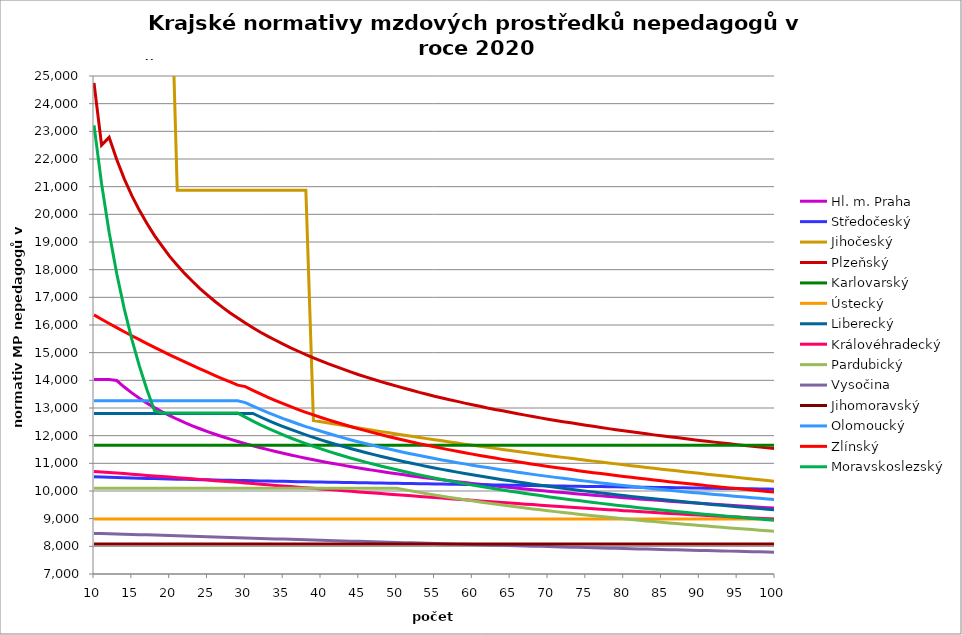
| Category | Hl. m. Praha | Středočeský | Jihočeský | Plzeňský | Karlovarský  | Ústecký   | Liberecký | Královéhradecký | Pardubický | Vysočina | Jihomoravský | Olomoucký | Zlínský | Moravskoslezský |
|---|---|---|---|---|---|---|---|---|---|---|---|---|---|---|
| 10.0 | 14030.172 | 10510.891 | 71798.217 | 24750.675 | 11657.998 | 8987.069 | 12801.653 | 10708.378 | 10101.406 | 8467.955 | 8087.211 | 13264.813 | 16364.86 | 23220 |
| 11.0 | 14030.172 | 10501.639 | 30465.73 | 22502.455 | 11657.998 | 8987.069 | 12801.653 | 10686.326 | 10101.406 | 8467.955 | 8087.211 | 13264.813 | 16208.331 | 21109.091 |
| 12.0 | 14030.172 | 10492.891 | 30465.73 | 22782.104 | 11657.998 | 8987.069 | 12801.653 | 10668.75 | 10101.406 | 8458.902 | 8087.211 | 13264.813 | 16054.768 | 19350 |
| 13.0 | 13992.888 | 10484.567 | 30465.73 | 21980.815 | 11657.998 | 8987.069 | 12801.653 | 10646.861 | 10101.406 | 8450.127 | 8087.211 | 13264.813 | 15904.087 | 17861.538 |
| 14.0 | 13757.851 | 10476.603 | 30465.73 | 21283.282 | 11657.998 | 8987.069 | 12801.653 | 10629.414 | 10101.406 | 8441.112 | 8087.211 | 13264.813 | 15756.209 | 16585.714 |
| 15.0 | 13545.701 | 10468.951 | 30465.73 | 20675.188 | 11657.998 | 8987.069 | 12801.653 | 10607.686 | 10101.406 | 8432.116 | 8087.211 | 13264.813 | 15611.055 | 15480 |
| 16.0 | 13352.792 | 10461.57 | 30465.73 | 20145.055 | 11657.998 | 8987.069 | 12801.653 | 10586.047 | 10101.406 | 8423.14 | 8087.211 | 13264.813 | 15468.551 | 14512.5 |
| 17.0 | 13176.251 | 10454.428 | 30465.73 | 19669.528 | 11657.998 | 8987.069 | 12801.653 | 10564.495 | 10101.406 | 8414.439 | 8087.211 | 13264.813 | 15328.626 | 13658.824 |
| 18.0 | 13013.779 | 10447.497 | 30465.73 | 19229.371 | 11657.998 | 8987.069 | 12801.653 | 10543.031 | 10101.406 | 8405.5 | 8087.211 | 13264.813 | 15191.209 | 12900 |
| 19.0 | 12863.509 | 10440.756 | 30465.73 | 18847.156 | 11657.998 | 8987.069 | 12801.653 | 10525.923 | 10101.406 | 8396.835 | 8087.211 | 13264.813 | 15056.234 | 12816.692 |
| 20.0 | 12723.909 | 10434.184 | 30465.73 | 18479.839 | 11657.998 | 8987.069 | 12801.653 | 10504.615 | 10101.406 | 8387.933 | 8087.211 | 13264.813 | 14923.636 | 12816.692 |
| 21.0 | 12593.707 | 10427.766 | 20874.667 | 18162.483 | 11657.998 | 8987.069 | 12801.653 | 10483.394 | 10101.406 | 8379.304 | 8087.211 | 13264.813 | 14793.354 | 12816.692 |
| 22.0 | 12471.835 | 10421.487 | 20874.667 | 17855.844 | 11657.998 | 8987.069 | 12801.653 | 10462.258 | 10101.406 | 8370.44 | 8087.211 | 13264.813 | 14665.327 | 12816.692 |
| 23.0 | 12357.391 | 10415.336 | 20874.667 | 17581.841 | 11657.998 | 8987.069 | 12801.653 | 10441.207 | 10101.406 | 8361.847 | 8087.211 | 13264.813 | 14539.496 | 12816.692 |
| 24.0 | 12249.606 | 10409.301 | 20874.667 | 17316.121 | 11657.998 | 8987.069 | 12801.653 | 10420.241 | 10101.406 | 8353.271 | 8087.211 | 13264.813 | 14415.807 | 12816.692 |
| 25.0 | 12147.82 | 10403.374 | 20874.667 | 17079.503 | 11657.998 | 8987.069 | 12801.653 | 10395.192 | 10101.406 | 8344.713 | 8087.211 | 13264.813 | 14294.204 | 12816.692 |
| 26.0 | 12051.461 | 10397.546 | 20874.667 | 16849.265 | 11657.998 | 8987.069 | 12801.653 | 10374.41 | 10101.406 | 8336.173 | 8087.211 | 13264.813 | 14174.636 | 12816.692 |
| 27.0 | 11960.033 | 10391.81 | 20874.667 | 16635.209 | 11657.998 | 8987.069 | 12801.653 | 10353.711 | 10101.406 | 8327.65 | 8087.211 | 13264.813 | 14057.051 | 12816.692 |
| 28.0 | 11873.102 | 10386.159 | 20874.667 | 16436.342 | 11657.998 | 8987.069 | 12801.653 | 10333.094 | 10101.406 | 8319.144 | 8087.211 | 13264.813 | 13941.401 | 12816.692 |
| 29.0 | 11790.287 | 10380.587 | 20874.667 | 16251.773 | 11657.998 | 8987.069 | 12801.653 | 10312.56 | 10101.406 | 8310.656 | 8087.211 | 13264.813 | 13827.639 | 12816.692 |
| 30.0 | 11711.251 | 10375.09 | 20874.667 | 16071.303 | 11657.998 | 8987.069 | 12801.653 | 10292.106 | 10101.406 | 8302.434 | 8087.211 | 13194.255 | 13773.695 | 12667.838 |
| 31.0 | 11635.694 | 10369.663 | 20874.667 | 15903.991 | 11657.998 | 8987.069 | 12801.729 | 10267.669 | 10101.406 | 8293.98 | 8087.211 | 13069.125 | 13637.513 | 12525.737 |
| 32.0 | 11563.351 | 10364.301 | 20874.667 | 15740.126 | 11657.998 | 8987.069 | 12674.904 | 10247.393 | 10101.406 | 8285.543 | 8087.211 | 12946.347 | 13507.993 | 12391.152 |
| 33.0 | 11493.983 | 10359 | 20874.667 | 15588.435 | 11657.998 | 8987.069 | 12554.304 | 10227.197 | 10101.406 | 8277.124 | 8087.211 | 12832.488 | 13384.591 | 12263.441 |
| 34.0 | 11427.377 | 10353.757 | 20874.667 | 15448.315 | 11657.998 | 8987.069 | 12439.426 | 10203.067 | 10101.406 | 8268.968 | 8087.211 | 12727.142 | 13266.824 | 12142.034 |
| 35.0 | 11363.341 | 10348.57 | 20874.667 | 15310.69 | 11657.998 | 8987.069 | 12329.823 | 10183.046 | 10101.406 | 8260.582 | 8087.211 | 12617.091 | 13154.26 | 12026.425 |
| 36.0 | 11301.701 | 10343.434 | 20874.667 | 15175.497 | 11657.998 | 8987.069 | 12225.096 | 10163.102 | 10101.406 | 8252.458 | 8087.211 | 12521.555 | 13046.513 | 11916.162 |
| 37.0 | 11242.299 | 10338.347 | 20874.667 | 15050.903 | 11657.998 | 8987.069 | 12124.887 | 10139.273 | 10101.406 | 8244.106 | 8087.211 | 12421.232 | 12943.237 | 11810.844 |
| 38.0 | 11184.993 | 10333.307 | 20874.667 | 14928.339 | 11657.998 | 8987.069 | 12028.872 | 10119.501 | 10101.406 | 8236.26 | 8087.211 | 12328.628 | 12844.119 | 11710.106 |
| 39.0 | 11129.652 | 10328.311 | 12552.227 | 14815.733 | 11657.998 | 8987.069 | 11936.761 | 10095.875 | 10101.406 | 8227.94 | 8087.211 | 12243.435 | 12748.875 | 11613.624 |
| 40.0 | 11076.156 | 10323.357 | 12505.236 | 14704.813 | 11657.998 | 8987.069 | 11848.29 | 10076.272 | 10101.406 | 8219.881 | 8087.211 | 12159.412 | 12657.249 | 11521.103 |
| 41.0 | 11024.399 | 10318.444 | 12458.71 | 14595.541 | 11657.998 | 8987.069 | 11763.22 | 10052.848 | 10101.406 | 8211.837 | 8087.211 | 12076.534 | 12569.008 | 11432.276 |
| 42.0 | 10974.278 | 10313.569 | 12412.64 | 14495.519 | 11657.998 | 8987.069 | 11681.333 | 10033.411 | 10101.406 | 8204.053 | 8087.211 | 11994.778 | 12483.939 | 11346.899 |
| 43.0 | 10925.703 | 10308.731 | 12367.023 | 14396.859 | 11657.998 | 8987.069 | 11602.43 | 10010.185 | 10101.406 | 8196.04 | 8087.211 | 11919.846 | 12401.848 | 11264.754 |
| 44.0 | 10878.588 | 10303.928 | 12321.85 | 14299.532 | 11657.998 | 8987.069 | 11526.33 | 9990.913 | 10101.406 | 8188.043 | 8087.211 | 11845.845 | 12322.558 | 11185.638 |
| 45.0 | 10832.856 | 10299.159 | 12277.116 | 14203.512 | 11657.998 | 8987.069 | 11452.867 | 9967.883 | 10101.406 | 8180.062 | 8087.211 | 11772.757 | 12245.904 | 11109.366 |
| 46.0 | 10788.434 | 10294.422 | 12232.815 | 14116.016 | 11657.998 | 8987.069 | 11381.886 | 9948.773 | 10101.406 | 8172.096 | 8087.211 | 11706.088 | 12171.738 | 11035.771 |
| 47.0 | 10745.255 | 10289.716 | 12188.942 | 14029.592 | 11657.998 | 8987.069 | 11313.248 | 9925.937 | 10101.406 | 8164.387 | 8087.211 | 11640.169 | 12099.92 | 10964.696 |
| 48.0 | 10703.256 | 10285.04 | 12145.489 | 13944.219 | 11657.998 | 8987.069 | 11246.822 | 9906.987 | 10101.406 | 8156.452 | 8087.211 | 11574.988 | 12030.323 | 10895.998 |
| 49.0 | 10662.381 | 10280.393 | 12102.453 | 13866.868 | 11657.998 | 8987.069 | 11182.49 | 9884.343 | 10101.406 | 8148.532 | 8087.211 | 11515.877 | 11962.829 | 10829.547 |
| 50.0 | 10622.575 | 10275.773 | 12059.827 | 13790.371 | 11657.998 | 8987.069 | 11120.139 | 9865.551 | 10101.406 | 8140.627 | 8087.211 | 11452.078 | 11897.328 | 10765.219 |
| 51.0 | 10583.788 | 10271.18 | 12017.605 | 13714.713 | 11657.998 | 8987.069 | 11059.667 | 9843.096 | 10050.07 | 8133.216 | 8087.211 | 11394.212 | 11833.719 | 10702.903 |
| 52.0 | 10545.973 | 10266.613 | 11975.783 | 13639.881 | 11657.998 | 8987.069 | 11000.978 | 9824.46 | 9999.816 | 8125.341 | 8087.211 | 11336.929 | 11771.907 | 10642.494 |
| 53.0 | 10509.086 | 10262.071 | 11934.355 | 13565.861 | 11657.998 | 8987.069 | 10943.984 | 9802.191 | 9950.984 | 8117.482 | 8087.211 | 11280.218 | 11711.805 | 10583.894 |
| 54.0 | 10473.085 | 10257.553 | 11893.317 | 13499.264 | 11657.998 | 8987.069 | 10888.602 | 9783.71 | 9903.505 | 8110.112 | 8087.211 | 11229.153 | 11653.33 | 10527.013 |
| 55.0 | 10437.934 | 10253.058 | 11852.662 | 13426.758 | 11657.998 | 8987.069 | 10834.754 | 9761.625 | 9857.315 | 8102.519 | 8087.211 | 11173.514 | 11596.407 | 10471.768 |
| 56.0 | 10403.595 | 10248.585 | 11812.386 | 13361.516 | 11657.998 | 8987.069 | 10782.37 | 9743.297 | 9812.354 | 8094.704 | 8087.211 | 11123.408 | 11540.963 | 10418.08 |
| 57.0 | 10370.034 | 10244.135 | 11772.484 | 13296.905 | 11657.998 | 8987.069 | 10731.38 | 9721.394 | 9768.568 | 8087.139 | 8087.211 | 11073.75 | 11486.932 | 10365.875 |
| 58.0 | 10337.219 | 10239.705 | 11732.952 | 13239.287 | 11657.998 | 8987.069 | 10681.723 | 9703.216 | 9725.903 | 8079.825 | 8087.211 | 11024.533 | 11434.251 | 10315.085 |
| 59.0 | 10305.121 | 10235.296 | 11693.784 | 13175.851 | 11657.998 | 8987.069 | 10633.34 | 9681.493 | 9684.311 | 8072.053 | 8087.211 | 10980.611 | 11382.861 | 10265.646 |
| 60.0 | 10273.71 | 10230.906 | 11654.976 | 13119.275 | 11657.998 | 8987.069 | 10586.173 | 9663.464 | 9643.744 | 8064.531 | 8087.211 | 10932.217 | 11332.707 | 10217.498 |
| 61.0 | 10242.961 | 10226.536 | 11616.524 | 13063.183 | 11657.998 | 8987.069 | 10540.173 | 9641.918 | 9604.161 | 8057.258 | 8087.211 | 10889.025 | 11283.738 | 10170.585 |
| 62.0 | 10212.847 | 10222.185 | 11578.422 | 13001.418 | 11657.998 | 8987.069 | 10495.289 | 9624.036 | 9565.521 | 8049.763 | 8087.211 | 10846.174 | 11235.903 | 10124.853 |
| 63.0 | 10183.345 | 10217.852 | 11540.667 | 12946.328 | 11657.998 | 8987.069 | 10451.475 | 9602.665 | 9527.784 | 8042.516 | 8087.211 | 10803.659 | 11189.158 | 10080.252 |
| 64.0 | 10154.432 | 10213.536 | 11503.254 | 12897.749 | 11657.998 | 8987.069 | 10408.688 | 9584.928 | 9490.914 | 8035.049 | 8087.211 | 10761.475 | 11143.458 | 10036.735 |
| 65.0 | 10126.086 | 10209.238 | 11466.179 | 12843.531 | 11657.998 | 8987.069 | 10366.886 | 9563.73 | 9454.878 | 8027.596 | 8087.211 | 10719.62 | 11098.762 | 9994.259 |
| 66.0 | 10098.288 | 10204.956 | 11429.437 | 12789.767 | 11657.998 | 8987.069 | 10326.032 | 9546.137 | 9419.643 | 8020.621 | 8087.211 | 10678.089 | 11055.032 | 9952.781 |
| 67.0 | 10071.017 | 10200.691 | 11393.025 | 12742.354 | 11657.998 | 8987.069 | 10286.088 | 9525.11 | 9385.179 | 8013.194 | 8087.211 | 10641.441 | 11012.231 | 9912.262 |
| 68.0 | 10044.256 | 10196.442 | 11356.939 | 12695.291 | 11657.998 | 8987.069 | 10247.019 | 9507.658 | 9351.455 | 8005.782 | 8087.211 | 10600.513 | 10970.324 | 9872.665 |
| 69.0 | 10017.986 | 10192.208 | 11321.174 | 12642.759 | 11657.998 | 8987.069 | 10208.793 | 9486.801 | 9318.446 | 7998.614 | 8087.211 | 10564.395 | 10929.279 | 9833.954 |
| 70.0 | 9992.192 | 10187.99 | 11285.727 | 12596.427 | 11657.998 | 8987.069 | 10171.378 | 9469.489 | 9286.124 | 7991.458 | 8087.211 | 10528.523 | 10889.063 | 9796.096 |
| 71.0 | 9966.858 | 10183.786 | 11250.594 | 12550.434 | 11657.998 | 8987.069 | 10134.746 | 9452.24 | 9254.466 | 7984.316 | 8087.211 | 10492.893 | 10849.647 | 9759.06 |
| 72.0 | 9941.968 | 10179.597 | 11215.771 | 12504.775 | 11657.998 | 8987.069 | 10098.867 | 9431.625 | 9223.448 | 7977.186 | 8087.211 | 10457.504 | 10811.003 | 9722.814 |
| 73.0 | 9917.508 | 10175.421 | 11181.254 | 12465.095 | 11657.998 | 8987.069 | 10063.716 | 9414.514 | 9193.046 | 7970.299 | 8087.211 | 10422.353 | 10773.105 | 9687.331 |
| 74.0 | 9893.464 | 10171.26 | 11147.04 | 12420.054 | 11657.998 | 8987.069 | 10029.266 | 9397.465 | 9163.241 | 7962.965 | 8087.211 | 10387.437 | 10735.927 | 9652.584 |
| 75.0 | 9869.824 | 10167.112 | 11113.124 | 12375.338 | 11657.998 | 8987.069 | 9995.494 | 9377.087 | 9134.012 | 7955.873 | 8087.211 | 10357.077 | 10699.444 | 9618.546 |
| 76.0 | 9846.574 | 10162.977 | 11079.505 | 12336.474 | 11657.998 | 8987.069 | 9962.378 | 9360.173 | 9105.34 | 7949.023 | 8087.211 | 10322.597 | 10663.633 | 9585.194 |
| 77.0 | 9823.703 | 10158.855 | 11046.177 | 12297.853 | 11657.998 | 8987.069 | 9929.894 | 9343.32 | 9077.206 | 7941.728 | 8087.211 | 10292.614 | 10628.473 | 9552.504 |
| 78.0 | 9801.199 | 10154.746 | 11013.138 | 12254.011 | 11657.998 | 8987.069 | 9898.022 | 9326.528 | 9049.592 | 7934.902 | 8087.211 | 10258.561 | 10593.942 | 9520.454 |
| 79.0 | 9779.052 | 10150.649 | 10980.384 | 12215.904 | 11657.998 | 8987.069 | 9866.743 | 9309.795 | 9022.483 | 7927.86 | 8087.211 | 10228.948 | 10560.02 | 9489.022 |
| 80.0 | 9757.251 | 10146.565 | 10947.911 | 12178.034 | 11657.998 | 8987.069 | 9836.037 | 9289.796 | 8995.862 | 7921.057 | 8087.211 | 10199.507 | 10526.688 | 9458.189 |
| 81.0 | 9735.785 | 10142.492 | 10915.718 | 12140.397 | 11657.998 | 8987.069 | 9805.886 | 9273.195 | 8969.714 | 7914.04 | 8087.211 | 10170.234 | 10493.928 | 9427.934 |
| 82.0 | 9714.646 | 10138.43 | 10883.8 | 12102.993 | 11657.998 | 8987.069 | 9776.273 | 9256.654 | 8944.024 | 7907.261 | 8087.211 | 10141.128 | 10461.722 | 9398.24 |
| 83.0 | 9693.824 | 10134.381 | 10852.154 | 12065.818 | 11657.998 | 8987.069 | 9747.182 | 9240.171 | 8918.779 | 7900.494 | 8087.211 | 10112.189 | 10430.054 | 9369.09 |
| 84.0 | 9673.31 | 10130.342 | 10820.777 | 12028.871 | 11657.998 | 8987.069 | 9718.595 | 9223.747 | 8893.964 | 7893.738 | 8087.211 | 10083.415 | 10398.906 | 9340.465 |
| 85.0 | 9653.096 | 10126.314 | 10789.666 | 11997.382 | 11657.998 | 8987.069 | 9690.499 | 9207.381 | 8869.568 | 7886.769 | 8087.211 | 10054.803 | 10368.265 | 9312.351 |
| 86.0 | 9633.173 | 10122.297 | 10758.818 | 11960.853 | 11657.998 | 8987.069 | 9662.878 | 9191.073 | 8845.578 | 7880.261 | 8087.211 | 10030.408 | 10338.115 | 9284.731 |
| 87.0 | 9613.534 | 10118.291 | 10728.23 | 11929.718 | 11657.998 | 8987.069 | 9635.719 | 9174.823 | 8821.982 | 7873.316 | 8087.211 | 10002.097 | 10308.442 | 9257.591 |
| 88.0 | 9594.171 | 10114.295 | 10697.899 | 11893.599 | 11657.998 | 8987.069 | 9609.009 | 9158.63 | 8798.768 | 7866.606 | 8087.211 | 9973.945 | 10279.233 | 9230.917 |
| 89.0 | 9575.076 | 10110.309 | 10667.823 | 11862.813 | 11657.998 | 8987.069 | 9582.733 | 9145.717 | 8775.927 | 7860.131 | 8087.211 | 9949.94 | 10250.474 | 9204.694 |
| 90.0 | 9556.244 | 10106.333 | 10637.997 | 11827.097 | 11657.998 | 8987.069 | 9556.881 | 9129.627 | 8753.447 | 7853.444 | 8087.211 | 9926.05 | 10222.153 | 9178.911 |
| 91.0 | 9537.666 | 10102.368 | 10608.421 | 11796.654 | 11657.998 | 8987.069 | 9531.44 | 9113.593 | 8731.319 | 7846.768 | 8087.211 | 9898.324 | 10194.258 | 9153.555 |
| 92.0 | 9519.337 | 10098.411 | 10579.09 | 11766.367 | 11657.998 | 8987.069 | 9506.4 | 9097.616 | 8709.533 | 7840.104 | 8087.211 | 9874.682 | 10166.778 | 9128.613 |
| 93.0 | 9501.251 | 10094.465 | 10550.002 | 11736.236 | 11657.998 | 8987.069 | 9481.748 | 9084.874 | 8688.08 | 7833.673 | 8087.211 | 9851.152 | 10139.701 | 9104.074 |
| 94.0 | 9483.401 | 10090.527 | 10521.155 | 11706.258 | 11657.998 | 8987.069 | 9457.474 | 9068.997 | 8666.951 | 7826.809 | 8087.211 | 9827.734 | 10113.016 | 9079.927 |
| 95.0 | 9465.781 | 10086.599 | 10492.545 | 11676.433 | 11657.998 | 8987.069 | 9433.57 | 9056.335 | 8646.137 | 7820.4 | 8087.211 | 9804.427 | 10086.714 | 9056.161 |
| 96.0 | 9448.386 | 10082.68 | 10464.171 | 11646.76 | 11657.998 | 8987.069 | 9410.023 | 9040.557 | 8625.631 | 7814.001 | 8087.211 | 9781.23 | 10060.784 | 9032.766 |
| 97.0 | 9431.211 | 10078.77 | 10436.03 | 11617.237 | 11657.998 | 8987.069 | 9386.826 | 9027.975 | 8605.423 | 7807.392 | 8087.211 | 9758.143 | 10035.217 | 9009.732 |
| 98.0 | 9414.25 | 10074.869 | 10408.118 | 11587.863 | 11657.998 | 8987.069 | 9363.969 | 9012.296 | 8585.507 | 7801.014 | 8087.211 | 9735.165 | 10010.003 | 8987.05 |
| 99.0 | 9397.498 | 10070.976 | 10380.434 | 11558.638 | 11657.998 | 8987.069 | 9341.444 | 8999.792 | 8565.876 | 7794.647 | 8087.211 | 9712.294 | 9985.134 | 8964.711 |
| 100.0 | 9380.95 | 10067.092 | 10352.976 | 11529.56 | 11657.998 | 8987.069 | 9319.242 | 8987.322 | 8546.521 | 7788.071 | 8087.211 | 9689.531 | 9960.602 | 8942.705 |